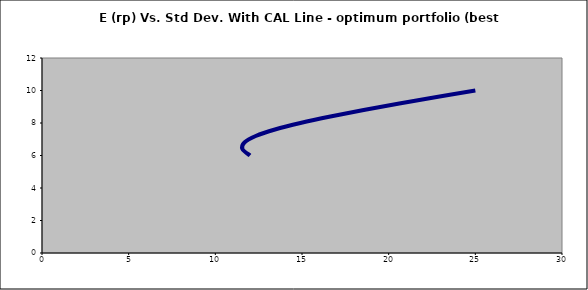
| Category | Series 0 |
|---|---|
| 12.0 | 6 |
| 11.562439189029279 | 6.4 |
| 11.677328461596 | 6.8 |
| 12.32923355282071 | 7.2 |
| 13.440238093129153 | 7.6 |
| 14.908051515875574 | 8 |
| 16.63850954863446 | 8.4 |
| 18.558286558839423 | 8.8 |
| 20.614557962760202 | 9.2 |
| 22.770375490975105 | 9.6 |
| 24.999999999999996 | 10 |